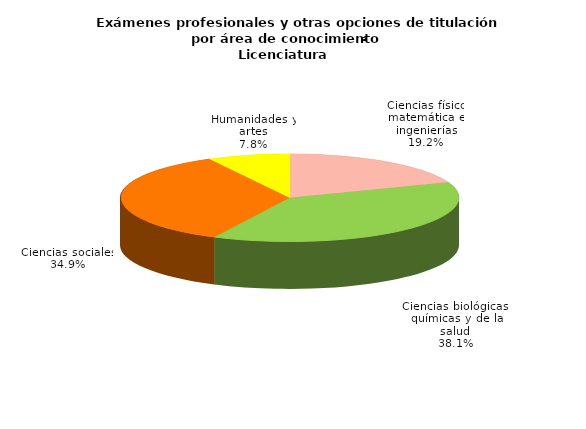
| Category | Series 0 |
|---|---|
| Ciencias físico matemática e ingenierías | 4574 |
| Ciencias biológicas, químicas y de la salud | 9063 |
| Ciencias sociales | 8314 |
| Humanidades y artes | 1854 |